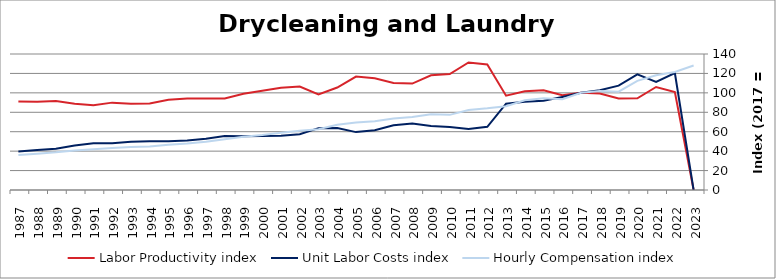
| Category | Labor Productivity index | Unit Labor Costs index | Hourly Compensation index |
|---|---|---|---|
| 2023.0 | 0 | 0 | 128.202 |
| 2022.0 | 100.897 | 120.432 | 121.512 |
| 2021.0 | 106.056 | 111.375 | 118.119 |
| 2020.0 | 94.39 | 119.049 | 112.37 |
| 2019.0 | 94.232 | 107.393 | 101.199 |
| 2018.0 | 99.268 | 102.783 | 102.031 |
| 2017.0 | 100 | 100 | 100 |
| 2016.0 | 97.524 | 95.812 | 93.44 |
| 2015.0 | 102.762 | 91.935 | 94.475 |
| 2014.0 | 101.697 | 90.874 | 92.416 |
| 2013.0 | 97.101 | 88.832 | 86.256 |
| 2012.0 | 129.208 | 65.044 | 84.042 |
| 2011.0 | 131.263 | 62.786 | 82.415 |
| 2010.0 | 119.314 | 64.834 | 77.356 |
| 2009.0 | 118.065 | 65.956 | 77.872 |
| 2008.0 | 109.565 | 68.553 | 75.111 |
| 2007.0 | 110.26 | 66.71 | 73.554 |
| 2006.0 | 114.946 | 61.487 | 70.677 |
| 2005.0 | 116.773 | 59.589 | 69.585 |
| 2004.0 | 105.457 | 63.762 | 67.241 |
| 2003.0 | 98.38 | 63.682 | 62.651 |
| 2002.0 | 106.465 | 57.353 | 61.061 |
| 2001.0 | 105.323 | 55.857 | 58.831 |
| 2000.0 | 102.056 | 55.506 | 56.648 |
| 1999.0 | 99.057 | 55.422 | 54.899 |
| 1998.0 | 94.22 | 55.46 | 52.255 |
| 1997.0 | 94.233 | 52.795 | 49.751 |
| 1996.0 | 94.263 | 50.836 | 47.92 |
| 1995.0 | 92.951 | 50.214 | 46.674 |
| 1994.0 | 89.067 | 50.205 | 44.716 |
| 1993.0 | 88.846 | 49.784 | 44.231 |
| 1992.0 | 89.939 | 48.078 | 43.241 |
| 1991.0 | 87.255 | 48.056 | 41.931 |
| 1990.0 | 88.901 | 45.82 | 40.734 |
| 1989.0 | 91.52 | 42.361 | 38.768 |
| 1988.0 | 90.769 | 41.09 | 37.297 |
| 1987.0 | 91.093 | 39.625 | 36.096 |